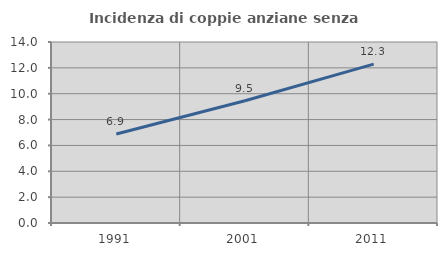
| Category | Incidenza di coppie anziane senza figli  |
|---|---|
| 1991.0 | 6.888 |
| 2001.0 | 9.456 |
| 2011.0 | 12.291 |